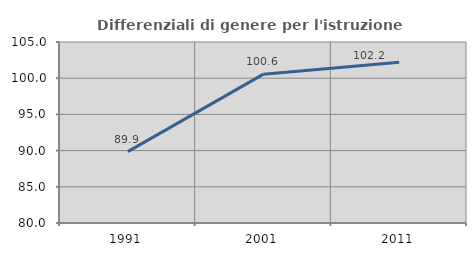
| Category | Differenziali di genere per l'istruzione superiore |
|---|---|
| 1991.0 | 89.864 |
| 2001.0 | 100.557 |
| 2011.0 | 102.192 |